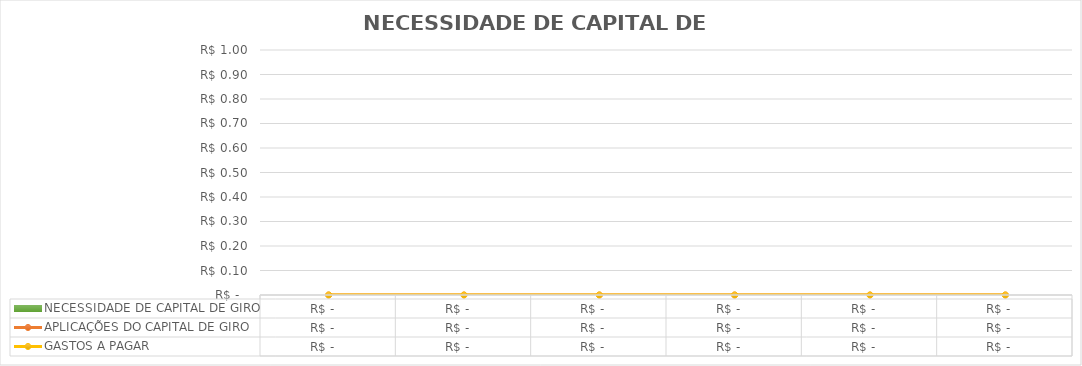
| Category |  NECESSIDADE DE CAPITAL DE GIRO  |
|---|---|
|  | 0 |
|  | 0 |
|  | 0 |
|  | 0 |
|  | 0 |
|  | 0 |